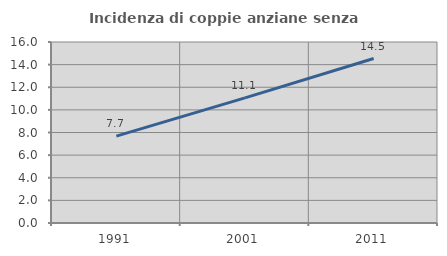
| Category | Incidenza di coppie anziane senza figli  |
|---|---|
| 1991.0 | 7.684 |
| 2001.0 | 11.065 |
| 2011.0 | 14.541 |